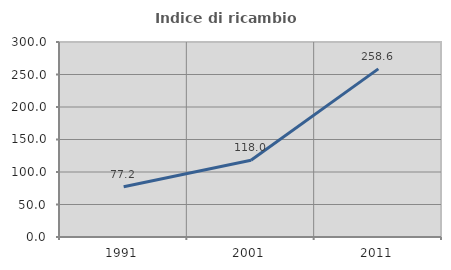
| Category | Indice di ricambio occupazionale  |
|---|---|
| 1991.0 | 77.211 |
| 2001.0 | 117.978 |
| 2011.0 | 258.649 |